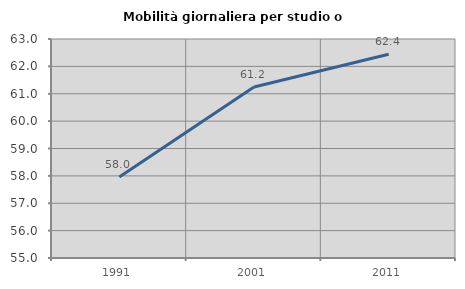
| Category | Mobilità giornaliera per studio o lavoro |
|---|---|
| 1991.0 | 57.962 |
| 2001.0 | 61.249 |
| 2011.0 | 62.445 |